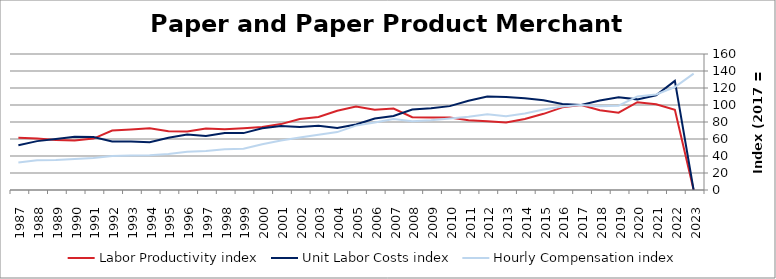
| Category | Labor Productivity index | Unit Labor Costs index | Hourly Compensation index |
|---|---|---|---|
| 2023.0 | 0 | 0 | 136.871 |
| 2022.0 | 94.404 | 128.347 | 121.166 |
| 2021.0 | 100.882 | 111.434 | 112.417 |
| 2020.0 | 103.255 | 106.628 | 110.099 |
| 2019.0 | 90.919 | 109.02 | 99.12 |
| 2018.0 | 93.773 | 105.223 | 98.67 |
| 2017.0 | 100 | 100 | 100 |
| 2016.0 | 97.202 | 101.152 | 98.322 |
| 2015.0 | 89.622 | 105.586 | 94.629 |
| 2014.0 | 83.527 | 107.896 | 90.122 |
| 2013.0 | 79.417 | 109.355 | 86.846 |
| 2012.0 | 80.951 | 110.063 | 89.097 |
| 2011.0 | 82.116 | 105.035 | 86.251 |
| 2010.0 | 85.376 | 98.674 | 84.244 |
| 2009.0 | 85.188 | 96.241 | 81.985 |
| 2008.0 | 85.646 | 94.595 | 81.017 |
| 2007.0 | 95.83 | 87.173 | 83.538 |
| 2006.0 | 94.549 | 84.032 | 79.451 |
| 2005.0 | 98.221 | 77.121 | 75.749 |
| 2004.0 | 93.311 | 72.996 | 68.113 |
| 2003.0 | 85.864 | 75.639 | 64.946 |
| 2002.0 | 83.49 | 73.998 | 61.781 |
| 2001.0 | 77.525 | 75.232 | 58.324 |
| 2000.0 | 74 | 72.624 | 53.742 |
| 1999.0 | 72.632 | 66.936 | 48.617 |
| 1998.0 | 71.581 | 67.041 | 47.989 |
| 1997.0 | 72.441 | 63.4 | 45.927 |
| 1996.0 | 68.873 | 65.371 | 45.023 |
| 1995.0 | 69.029 | 61.474 | 42.435 |
| 1994.0 | 72.677 | 56.15 | 40.808 |
| 1993.0 | 71.14 | 57.093 | 40.616 |
| 1992.0 | 70.018 | 57.058 | 39.951 |
| 1991.0 | 60.477 | 62.248 | 37.646 |
| 1990.0 | 58.349 | 62.637 | 36.548 |
| 1989.0 | 58.845 | 60.046 | 35.334 |
| 1988.0 | 60.647 | 57.503 | 34.874 |
| 1987.0 | 61.395 | 52.54 | 32.257 |